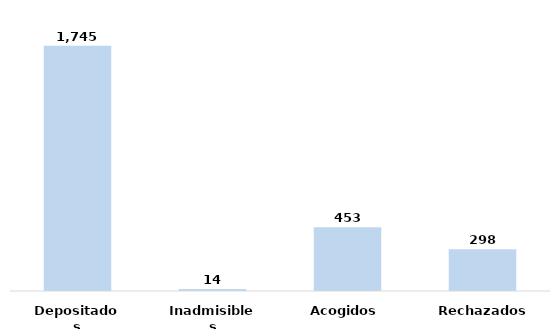
| Category | Series 0 |
|---|---|
| Depositados | 1745 |
| Inadmisibles | 14 |
| Acogidos | 453 |
| Rechazados | 298 |